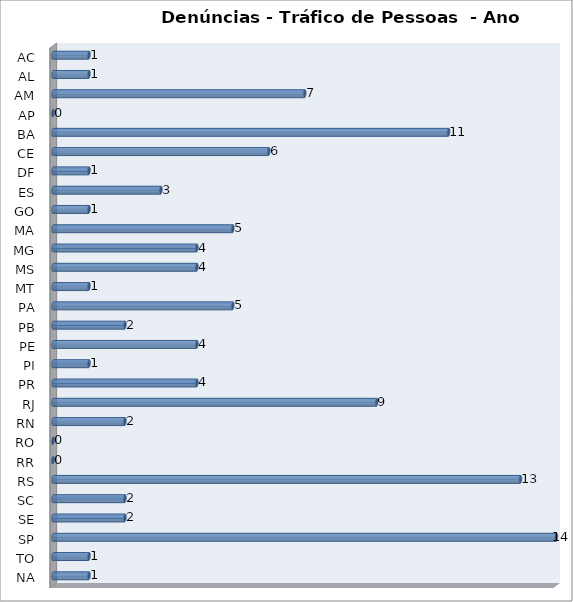
| Category | Series 0 |
|---|---|
| AC | 1 |
| AL | 1 |
| AM | 7 |
| AP | 0 |
| BA | 11 |
| CE | 6 |
| DF | 1 |
| ES | 3 |
| GO | 1 |
| MA | 5 |
| MG | 4 |
| MS | 4 |
| MT | 1 |
| PA | 5 |
| PB | 2 |
| PE | 4 |
| PI | 1 |
| PR | 4 |
| RJ | 9 |
| RN | 2 |
| RO | 0 |
| RR | 0 |
| RS | 13 |
| SC | 2 |
| SE | 2 |
| SP | 14 |
| TO | 1 |
| NA | 1 |